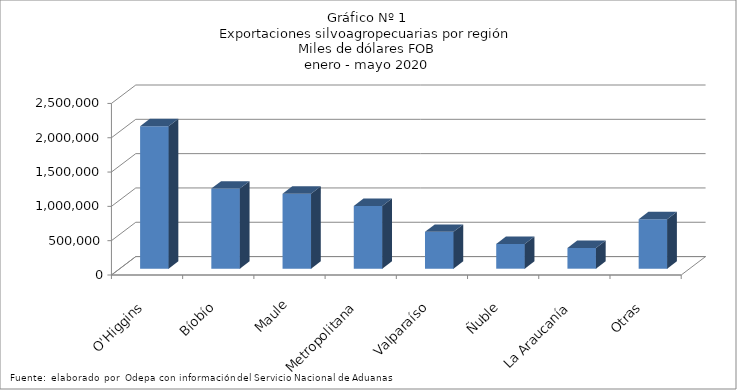
| Category | Series 0 |
|---|---|
| O'Higgins | 2076119.982 |
| Bíobío | 1168281.838 |
| Maule | 1093545.249 |
| Metropolitana | 914627.762 |
| Valparaíso | 537568.667 |
| Ñuble | 361319.274 |
| La Araucanía | 301480.265 |
| Otras | 720673.076 |